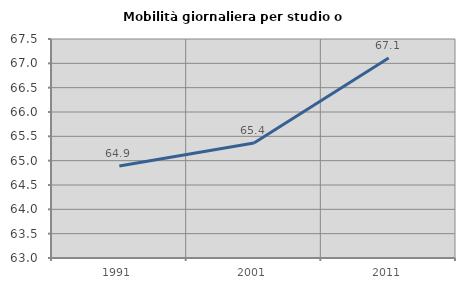
| Category | Mobilità giornaliera per studio o lavoro |
|---|---|
| 1991.0 | 64.889 |
| 2001.0 | 65.362 |
| 2011.0 | 67.109 |